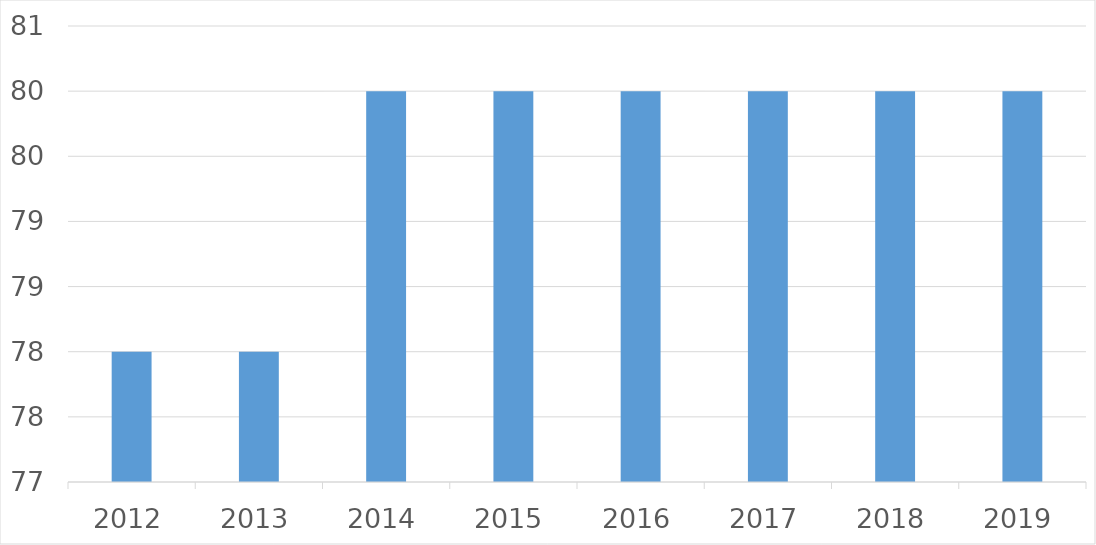
| Category | Series 0 |
|---|---|
| 2012 | 78 |
| 2013 | 78 |
| 2014 | 80 |
| 2015 | 80 |
| 2016 | 80 |
| 2017 | 80 |
| 2018 | 80 |
| 2019 | 80 |